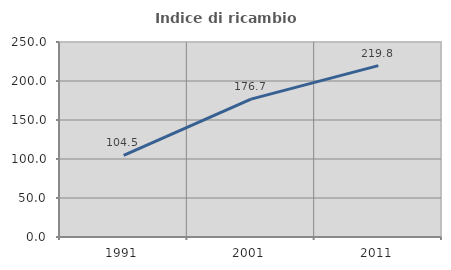
| Category | Indice di ricambio occupazionale  |
|---|---|
| 1991.0 | 104.545 |
| 2001.0 | 176.744 |
| 2011.0 | 219.767 |